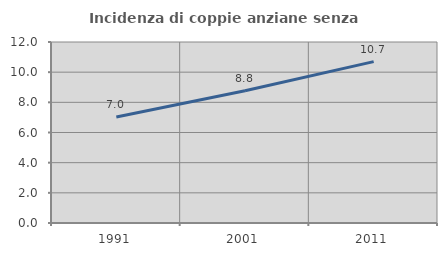
| Category | Incidenza di coppie anziane senza figli  |
|---|---|
| 1991.0 | 7.027 |
| 2001.0 | 8.762 |
| 2011.0 | 10.697 |